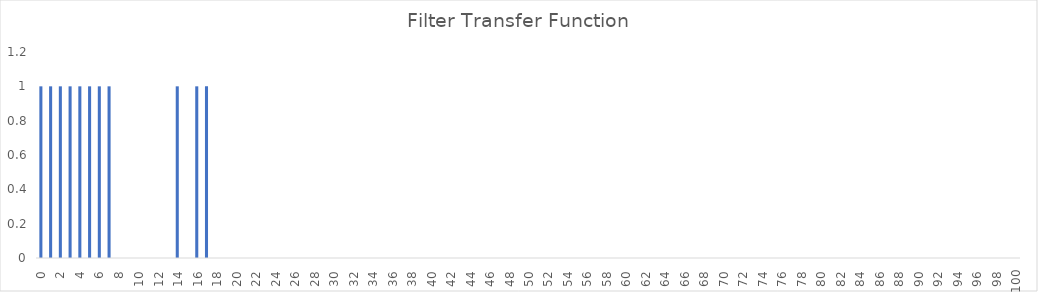
| Category | Filter Transfer Function |
|---|---|
| 0.0 | 1 |
| 1.0 | 1 |
| 2.0 | 1 |
| 3.0 | 1 |
| 4.0 | 1 |
| 5.0 | 1 |
| 6.0 | 1 |
| 7.0 | 1 |
| 8.0 | 0 |
| 9.0 | 0 |
| 10.0 | 0 |
| 11.0 | 0 |
| 12.0 | 0 |
| 13.0 | 0 |
| 14.0 | 1 |
| 15.0 | 0 |
| 16.0 | 1 |
| 17.0 | 1 |
| 18.0 | 0 |
| 19.0 | 0 |
| 20.0 | 0 |
| 21.0 | 0 |
| 22.0 | 0 |
| 23.0 | 0 |
| 24.0 | 0 |
| 25.0 | 0 |
| 26.0 | 0 |
| 27.0 | 0 |
| 28.0 | 0 |
| 29.0 | 0 |
| 30.0 | 0 |
| 31.0 | 0 |
| 32.0 | 0 |
| 33.0 | 0 |
| 34.0 | 0 |
| 35.0 | 0 |
| 36.0 | 0 |
| 37.0 | 0 |
| 38.0 | 0 |
| 39.0 | 0 |
| 40.0 | 0 |
| 41.0 | 0 |
| 42.0 | 0 |
| 43.0 | 0 |
| 44.0 | 0 |
| 45.0 | 0 |
| 46.0 | 0 |
| 47.0 | 0 |
| 48.0 | 0 |
| 49.0 | 0 |
| 50.0 | 0 |
| 51.0 | 0 |
| 52.0 | 0 |
| 53.0 | 0 |
| 54.0 | 0 |
| 55.0 | 0 |
| 56.0 | 0 |
| 57.0 | 0 |
| 58.0 | 0 |
| 59.0 | 0 |
| 60.0 | 0 |
| 61.0 | 0 |
| 62.0 | 0 |
| 63.0 | 0 |
| 64.0 | 0 |
| 65.0 | 0 |
| 66.0 | 0 |
| 67.0 | 0 |
| 68.0 | 0 |
| 69.0 | 0 |
| 70.0 | 0 |
| 71.0 | 0 |
| 72.0 | 0 |
| 73.0 | 0 |
| 74.0 | 0 |
| 75.0 | 0 |
| 76.0 | 0 |
| 77.0 | 0 |
| 78.0 | 0 |
| 79.0 | 0 |
| 80.0 | 0 |
| 81.0 | 0 |
| 82.0 | 0 |
| 83.0 | 0 |
| 84.0 | 0 |
| 85.0 | 0 |
| 86.0 | 0 |
| 87.0 | 0 |
| 88.0 | 0 |
| 89.0 | 0 |
| 90.0 | 0 |
| 91.0 | 0 |
| 92.0 | 0 |
| 93.0 | 0 |
| 94.0 | 0 |
| 95.0 | 0 |
| 96.0 | 0 |
| 97.0 | 0 |
| 98.0 | 0 |
| 99.0 | 0 |
| 100.0 | 0 |